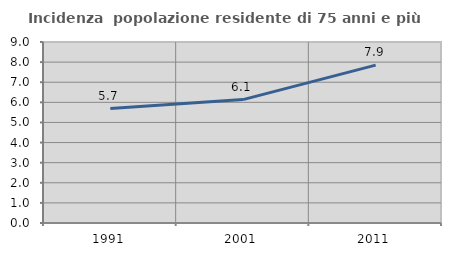
| Category | Incidenza  popolazione residente di 75 anni e più |
|---|---|
| 1991.0 | 5.689 |
| 2001.0 | 6.135 |
| 2011.0 | 7.85 |